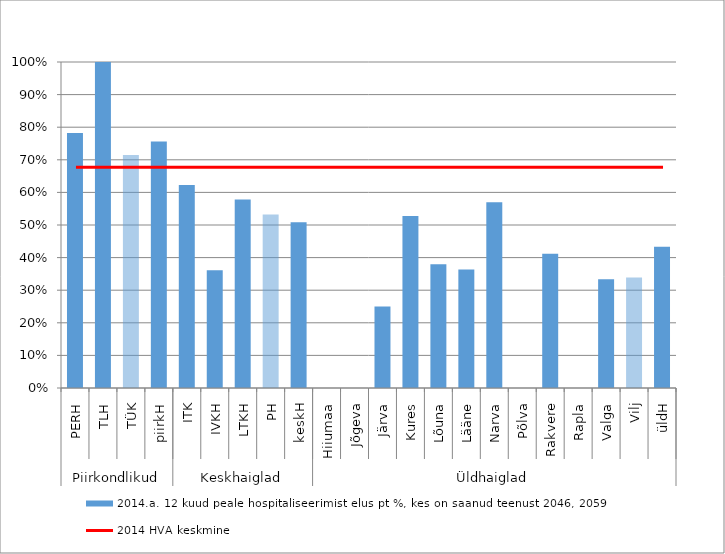
| Category | 2014.a. 12 kuud peale hospitaliseerimist elus pt %, kes on saanud teenust 2046, 2059 |
|---|---|
| 0 | 0.782 |
| 1 | 1 |
| 2 | 0.714 |
| 3 | 0.756 |
| 4 | 0.623 |
| 5 | 0.361 |
| 6 | 0.578 |
| 7 | 0.532 |
| 8 | 0.508 |
| 9 | 0 |
| 10 | 0 |
| 11 | 0.25 |
| 12 | 0.527 |
| 13 | 0.379 |
| 14 | 0.364 |
| 15 | 0.57 |
| 16 | 0 |
| 17 | 0.412 |
| 18 | 0 |
| 19 | 0.333 |
| 20 | 0.339 |
| 21 | 0.433 |